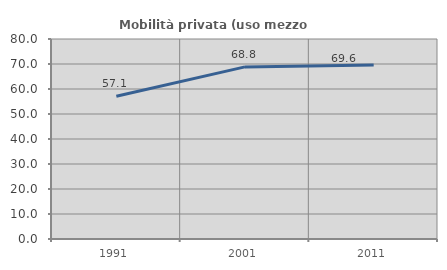
| Category | Mobilità privata (uso mezzo privato) |
|---|---|
| 1991.0 | 57.067 |
| 2001.0 | 68.847 |
| 2011.0 | 69.561 |